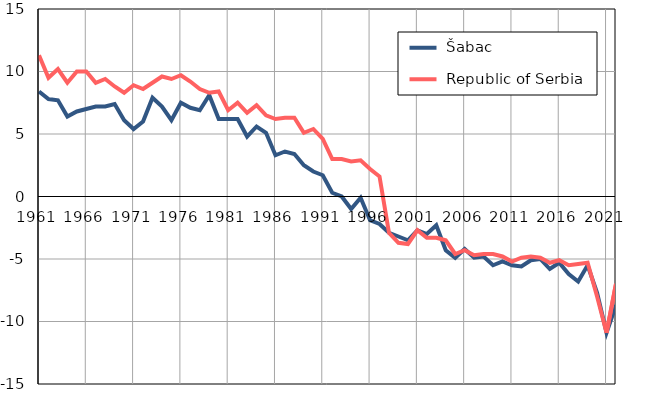
| Category |  Šabac |  Republic of Serbia |
|---|---|---|
| 1961.0 | 8.4 | 11.3 |
| 1962.0 | 7.8 | 9.5 |
| 1963.0 | 7.7 | 10.2 |
| 1964.0 | 6.4 | 9.1 |
| 1965.0 | 6.8 | 10 |
| 1966.0 | 7 | 10 |
| 1967.0 | 7.2 | 9.1 |
| 1968.0 | 7.2 | 9.4 |
| 1969.0 | 7.4 | 8.8 |
| 1970.0 | 6.1 | 8.3 |
| 1971.0 | 5.4 | 8.9 |
| 1972.0 | 6 | 8.6 |
| 1973.0 | 7.9 | 9.1 |
| 1974.0 | 7.2 | 9.6 |
| 1975.0 | 6.1 | 9.4 |
| 1976.0 | 7.5 | 9.7 |
| 1977.0 | 7.1 | 9.2 |
| 1978.0 | 6.9 | 8.6 |
| 1979.0 | 8.1 | 8.3 |
| 1980.0 | 6.2 | 8.4 |
| 1981.0 | 6.2 | 6.9 |
| 1982.0 | 6.2 | 7.5 |
| 1983.0 | 4.8 | 6.7 |
| 1984.0 | 5.6 | 7.3 |
| 1985.0 | 5.1 | 6.5 |
| 1986.0 | 3.3 | 6.2 |
| 1987.0 | 3.6 | 6.3 |
| 1988.0 | 3.4 | 6.3 |
| 1989.0 | 2.5 | 5.1 |
| 1990.0 | 2 | 5.4 |
| 1991.0 | 1.7 | 4.6 |
| 1992.0 | 0.3 | 3 |
| 1993.0 | 0 | 3 |
| 1994.0 | -1 | 2.8 |
| 1995.0 | -0.1 | 2.9 |
| 1996.0 | -1.9 | 2.2 |
| 1997.0 | -2.2 | 1.6 |
| 1998.0 | -2.9 | -2.9 |
| 1999.0 | -3.2 | -3.7 |
| 2000.0 | -3.5 | -3.8 |
| 2001.0 | -2.7 | -2.7 |
| 2002.0 | -3 | -3.3 |
| 2003.0 | -2.3 | -3.3 |
| 2004.0 | -4.3 | -3.5 |
| 2005.0 | -4.9 | -4.6 |
| 2006.0 | -4.2 | -4.3 |
| 2007.0 | -4.9 | -4.7 |
| 2008.0 | -4.8 | -4.6 |
| 2009.0 | -5.5 | -4.6 |
| 2010.0 | -5.2 | -4.8 |
| 2011.0 | -5.5 | -5.2 |
| 2012.0 | -5.6 | -4.9 |
| 2013.0 | -5.1 | -4.8 |
| 2014.0 | -5 | -4.9 |
| 2015.0 | -5.8 | -5.3 |
| 2016.0 | -5.3 | -5.1 |
| 2017.0 | -6.2 | -5.5 |
| 2018.0 | -6.8 | -5.4 |
| 2019.0 | -5.5 | -5.3 |
| 2020.0 | -7.7 | -8 |
| 2021.0 | -10.9 | -10.9 |
| 2022.0 | -8.7 | -7 |